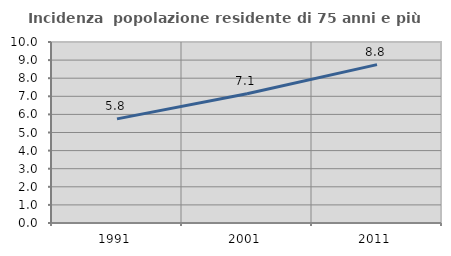
| Category | Incidenza  popolazione residente di 75 anni e più |
|---|---|
| 1991.0 | 5.752 |
| 2001.0 | 7.144 |
| 2011.0 | 8.751 |